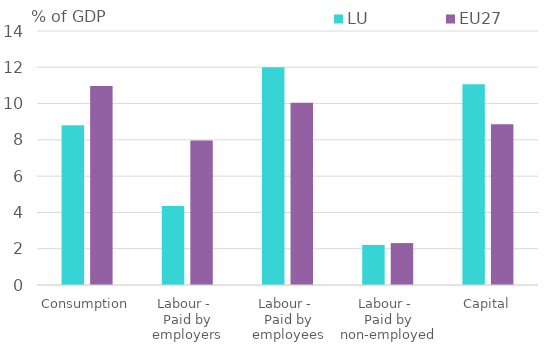
| Category | LU | EU27 |
|---|---|---|
| Consumption | 8.8 | 10.967 |
| Labour - 
Paid by employers | 4.361 | 7.966 |
| Labour - 
Paid by employees | 12.004 | 10.052 |
| Labour - 
Paid by non-employed | 2.21 | 2.311 |
| Capital | 11.072 | 8.858 |